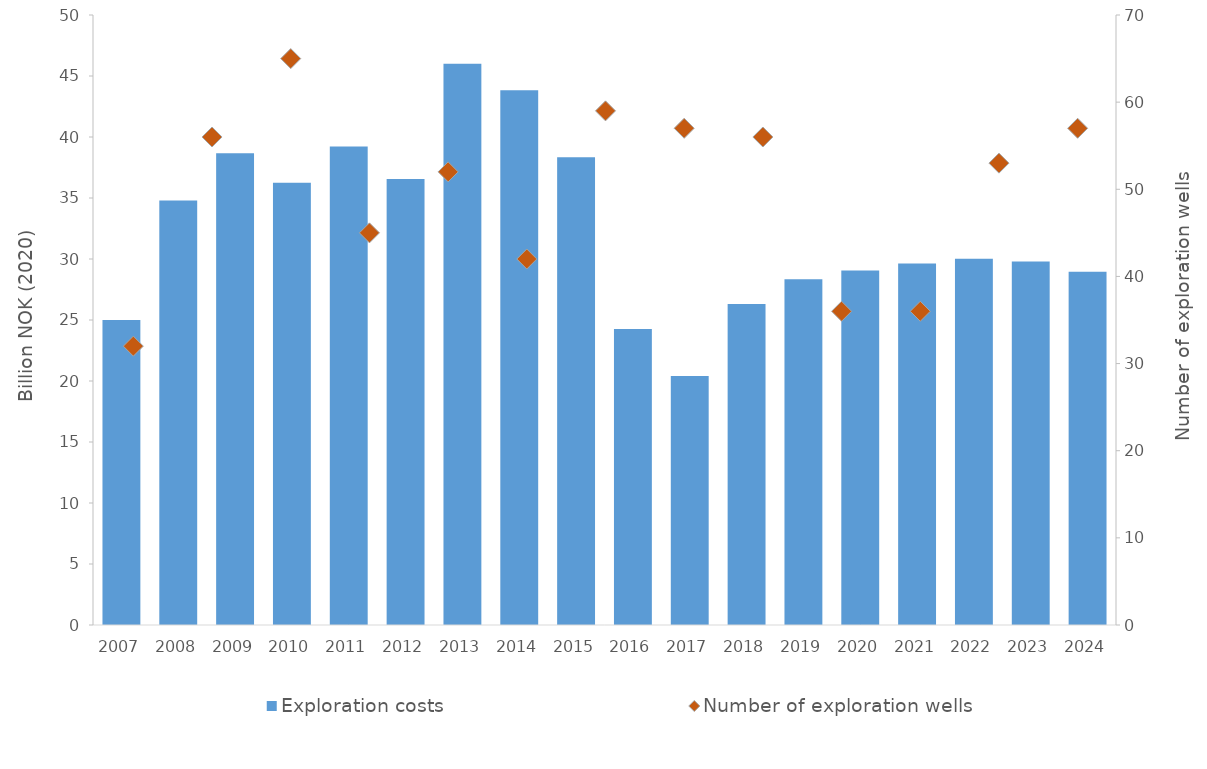
| Category | Exploration costs |
|---|---|
| 2007.0 | 24.999 |
| 2008.0 | 34.791 |
| 2009.0 | 38.671 |
| 2010.0 | 36.241 |
| 2011.0 | 39.23 |
| 2012.0 | 36.552 |
| 2013.0 | 46.005 |
| 2014.0 | 43.835 |
| 2015.0 | 38.342 |
| 2016.0 | 24.257 |
| 2017.0 | 20.415 |
| 2018.0 | 26.306 |
| 2019.0 | 28.336 |
| 2020.0 | 29.047 |
| 2021.0 | 29.639 |
| 2022.0 | 30.024 |
| 2023.0 | 29.805 |
| 2024.0 | 28.961 |